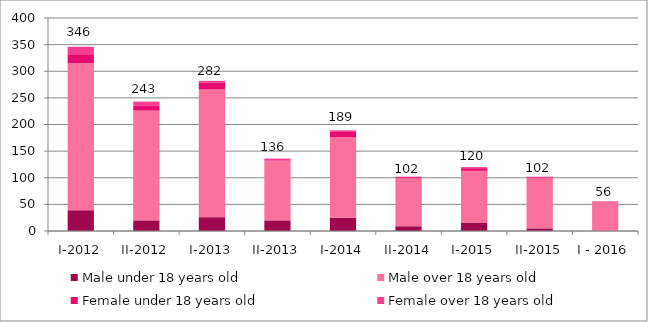
| Category | Male under 18 years old  | Male over 18 years old  | Female under 18 years old  | Female over 18 years old |
|---|---|---|---|---|
| I-2012 | 39 | 276 | 17 | 14 |
| II-2012 | 20 | 206 | 9 | 8 |
| I-2013 | 26 | 240 | 13 | 3 |
| II-2013 | 20 | 111 | 1 | 4 |
| I-2014 | 25 | 151 | 10 | 3 |
| II-2014 | 9 | 90 | 2 | 1 |
| I-2015 | 16 | 97 | 5 | 2 |
| II-2015 | 5 | 94 | 1 | 2 |
| I - 2016 | 0 | 56 | 0 | 0 |